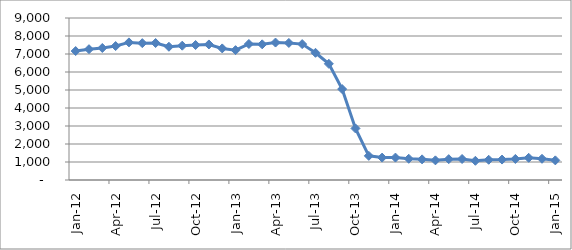
| Category | Series 0 |
|---|---|
| 2012-01-01 | 7164 |
| 2012-02-01 | 7267 |
| 2012-03-01 | 7335 |
| 2012-04-01 | 7441 |
| 2012-05-01 | 7645 |
| 2012-06-01 | 7603 |
| 2012-07-01 | 7610 |
| 2012-08-01 | 7402 |
| 2012-09-01 | 7461 |
| 2012-10-01 | 7500 |
| 2012-11-01 | 7531 |
| 2012-12-01 | 7310 |
| 2013-01-01 | 7214 |
| 2013-02-01 | 7556 |
| 2013-03-01 | 7538 |
| 2013-04-01 | 7636 |
| 2013-05-01 | 7614 |
| 2013-06-01 | 7550 |
| 2013-07-01 | 7066 |
| 2013-08-01 | 6454 |
| 2013-09-01 | 5050 |
| 2013-10-01 | 2864 |
| 2013-11-01 | 1341 |
| 2013-12-01 | 1244 |
| 2014-01-01 | 1245 |
| 2014-02-01 | 1179 |
| 2014-03-01 | 1146 |
| 2014-04-01 | 1092 |
| 2014-05-01 | 1158 |
| 2014-06-01 | 1167 |
| 2014-07-01 | 1066 |
| 2014-08-01 | 1124 |
| 2014-09-01 | 1136 |
| 2014-10-01 | 1170 |
| 2014-11-01 | 1233 |
| 2014-12-01 | 1179 |
| 2015-01-01 | 1091 |